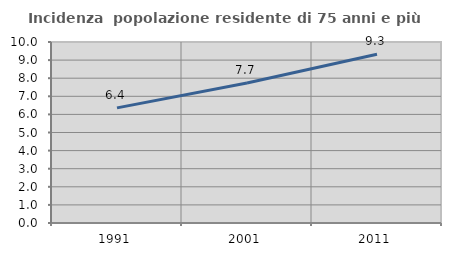
| Category | Incidenza  popolazione residente di 75 anni e più |
|---|---|
| 1991.0 | 6.362 |
| 2001.0 | 7.737 |
| 2011.0 | 9.319 |